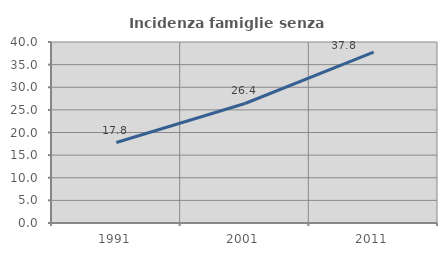
| Category | Incidenza famiglie senza nuclei |
|---|---|
| 1991.0 | 17.777 |
| 2001.0 | 26.41 |
| 2011.0 | 37.778 |